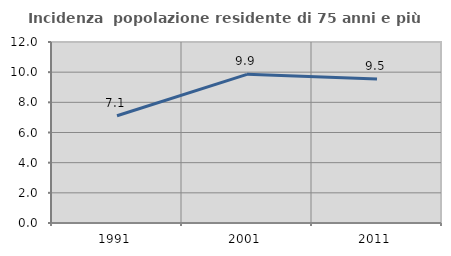
| Category | Incidenza  popolazione residente di 75 anni e più |
|---|---|
| 1991.0 | 7.109 |
| 2001.0 | 9.856 |
| 2011.0 | 9.542 |